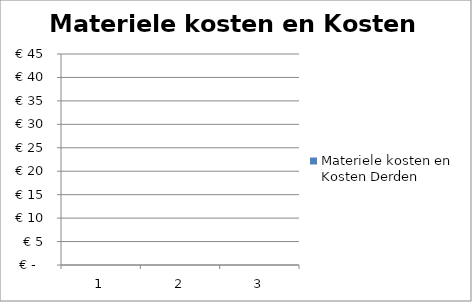
| Category | Materiele kosten en Kosten Derden |
|---|---|
| 0 | 0 |
| 1 | 0 |
| 2 | 0 |